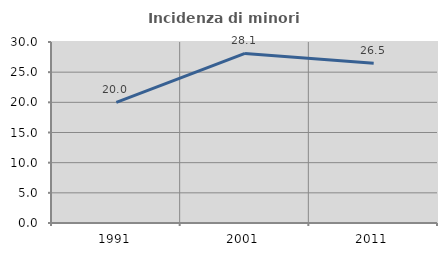
| Category | Incidenza di minori stranieri |
|---|---|
| 1991.0 | 20 |
| 2001.0 | 28.105 |
| 2011.0 | 26.479 |